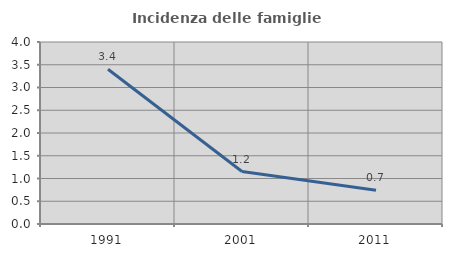
| Category | Incidenza delle famiglie numerose |
|---|---|
| 1991.0 | 3.401 |
| 2001.0 | 1.154 |
| 2011.0 | 0.739 |